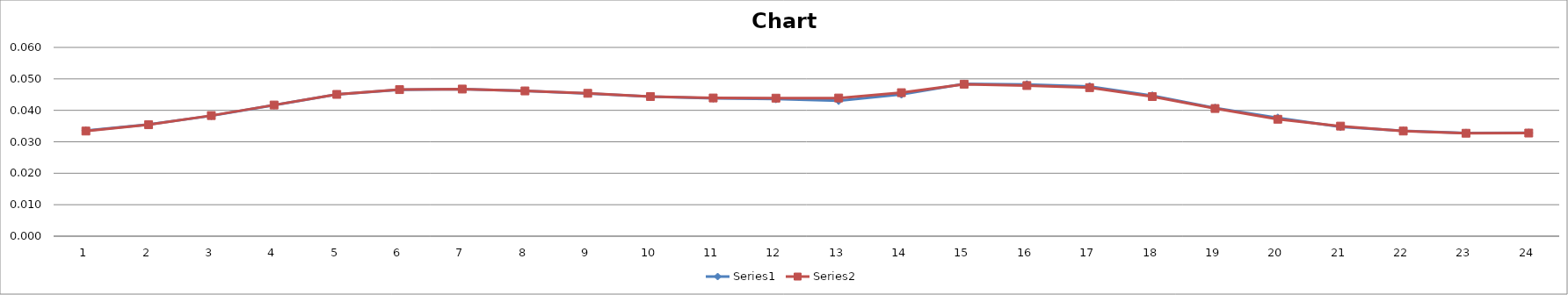
| Category | Series 0 | Series 1 |
|---|---|---|
| 0 | 0.034 | 0.033 |
| 1 | 0.035 | 0.035 |
| 2 | 0.038 | 0.038 |
| 3 | 0.042 | 0.042 |
| 4 | 0.045 | 0.045 |
| 5 | 0.047 | 0.047 |
| 6 | 0.047 | 0.047 |
| 7 | 0.046 | 0.046 |
| 8 | 0.045 | 0.045 |
| 9 | 0.044 | 0.044 |
| 10 | 0.044 | 0.044 |
| 11 | 0.044 | 0.044 |
| 12 | 0.043 | 0.044 |
| 13 | 0.045 | 0.046 |
| 14 | 0.048 | 0.048 |
| 15 | 0.048 | 0.048 |
| 16 | 0.048 | 0.047 |
| 17 | 0.045 | 0.044 |
| 18 | 0.041 | 0.041 |
| 19 | 0.038 | 0.037 |
| 20 | 0.035 | 0.035 |
| 21 | 0.034 | 0.033 |
| 22 | 0.033 | 0.033 |
| 23 | 0.033 | 0.033 |